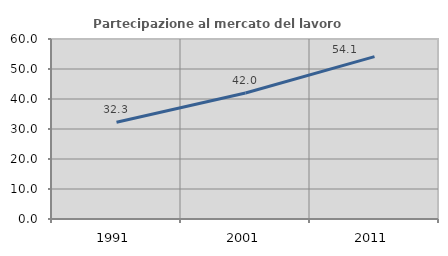
| Category | Partecipazione al mercato del lavoro  femminile |
|---|---|
| 1991.0 | 32.258 |
| 2001.0 | 42.009 |
| 2011.0 | 54.143 |